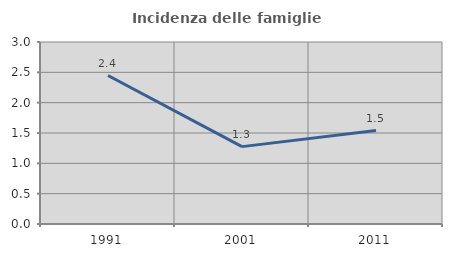
| Category | Incidenza delle famiglie numerose |
|---|---|
| 1991.0 | 2.448 |
| 2001.0 | 1.275 |
| 2011.0 | 1.54 |